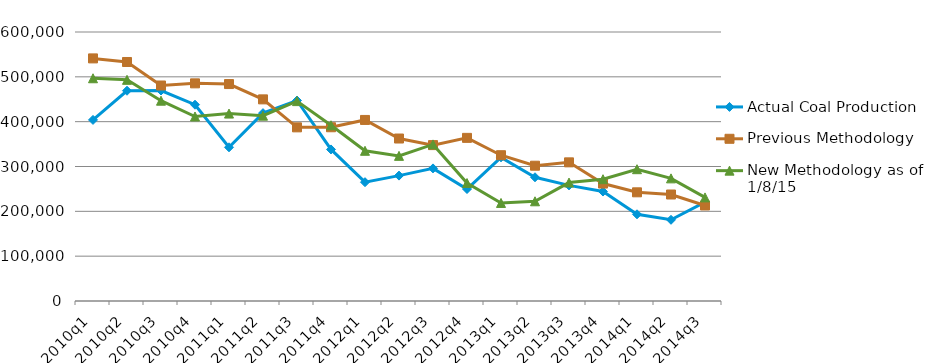
| Category | Actual Coal Production | Previous Methodology | New Methodology as of 1/8/15 |
|---|---|---|---|
| 2010q1 | 403913 | 541104 | 496824 |
| 2010q2 | 468967 | 533110 | 493349 |
| 2010q3 | 469491 | 480695 | 446786 |
| 2010q4 | 437807 | 485454 | 411536 |
| 2011q1 | 342823 | 483908 | 418019 |
| 2011q2 | 418986 | 449734 | 413356 |
| 2011q3 | 447203 | 387334 | 445830 |
| 2011q4 | 338023 | 387545 | 391955 |
| 2012q1 | 264991 | 403843 | 335044 |
| 2012q2 | 279705 | 362416 | 323719 |
| 2012q3 | 295768 | 347721 | 349295 |
| 2012q4 | 249783 | 363849 | 263119 |
| 2013q1 | 320430 | 325174 | 218692 |
| 2013q2 | 276005 | 301767 | 222411 |
| 2013q3 | 257842 | 309259 | 264158 |
| 2013q4 | 244160 | 261961 | 271691 |
| 2014q1 | 193404 | 242400 | 294003 |
| 2014q2 | 181125 | 237537 | 273525 |
| 2014q3 | 220702 | 213051 | 231040 |